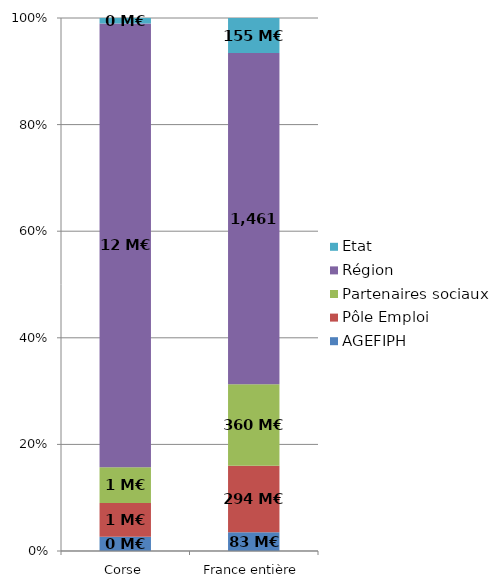
| Category | AGEFIPH | Pôle Emploi | Partenaires sociaux | Région | Etat |
|---|---|---|---|---|---|
| Corse | 0.374 | 0.898 | 0.944 | 11.739 | 0.146 |
| France entière | 82.716 | 293.959 | 359.593 | 1461.057 | 154.74 |